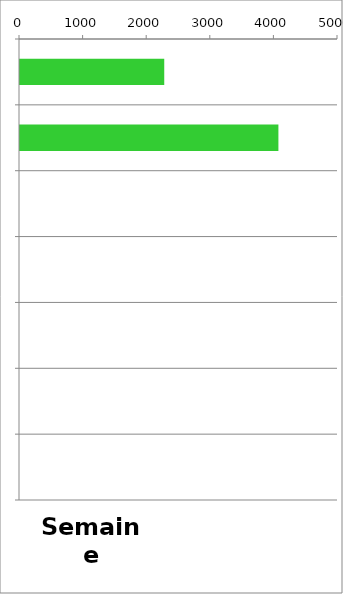
| Category | TV |
|---|---|
| 0 | 2268 |
| 1 | 4063 |
| 2 | 0 |
| 3 | 0 |
| 4 | 0 |
| 5 | 0 |
| 6 | 0 |